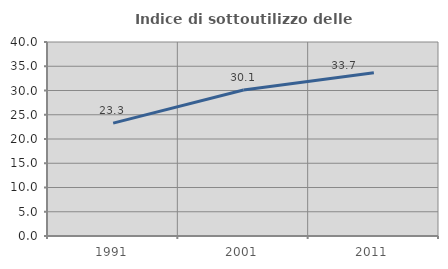
| Category | Indice di sottoutilizzo delle abitazioni  |
|---|---|
| 1991.0 | 23.279 |
| 2001.0 | 30.106 |
| 2011.0 | 33.662 |